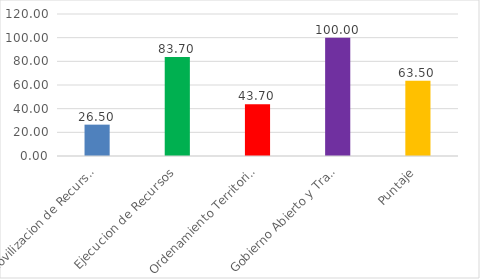
| Category | Series 0 |
|---|---|
| Movilizacion de Recursos | 26.5 |
| Ejecucion de Recursos | 83.7 |
| Ordenamiento Territorial | 43.7 |
| Gobierno Abierto y Transparencia | 100 |
| Puntaje | 63.5 |